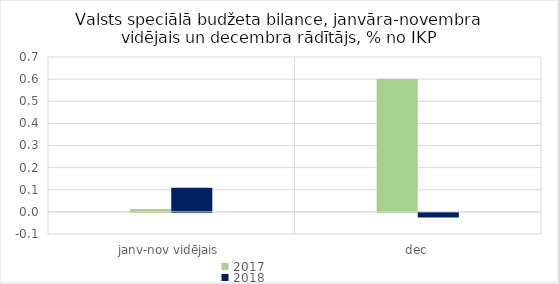
| Category | 2017 | 2018 |
|---|---|---|
| janv-nov vidējais | 0.013 | 0.109 |
| dec | 0.6 | -0.02 |